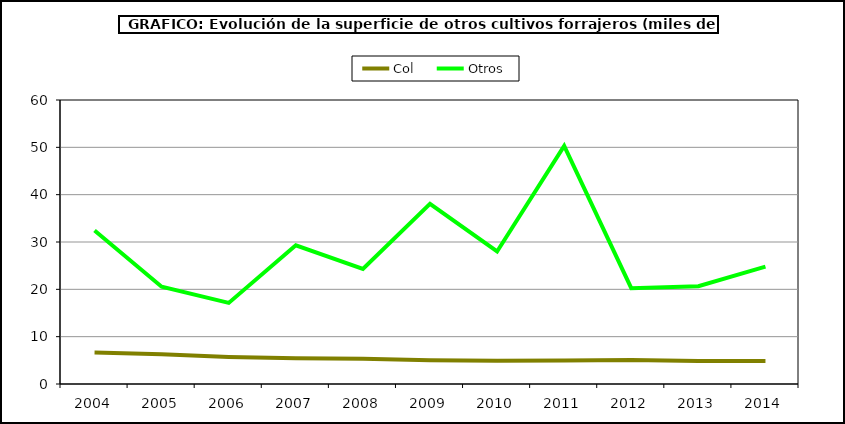
| Category | Col | Otros |
|---|---|---|
| 2004.0 | 6.639 | 32.411 |
| 2005.0 | 6.305 | 20.551 |
| 2006.0 | 5.722 | 17.127 |
| 2007.0 | 5.431 | 29.302 |
| 2008.0 | 5.333 | 24.321 |
| 2009.0 | 4.996 | 38.075 |
| 2010.0 | 4.899 | 27.997 |
| 2011.0 | 4.982 | 50.317 |
| 2012.0 | 5.09 | 20.245 |
| 2013.0 | 4.865 | 20.659 |
| 2014.0 | 4.875 | 24.797 |